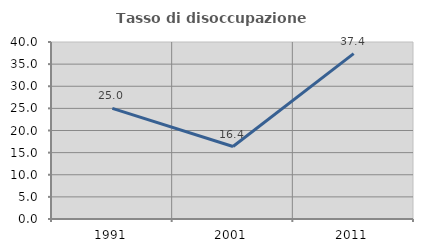
| Category | Tasso di disoccupazione giovanile  |
|---|---|
| 1991.0 | 25 |
| 2001.0 | 16.379 |
| 2011.0 | 37.374 |